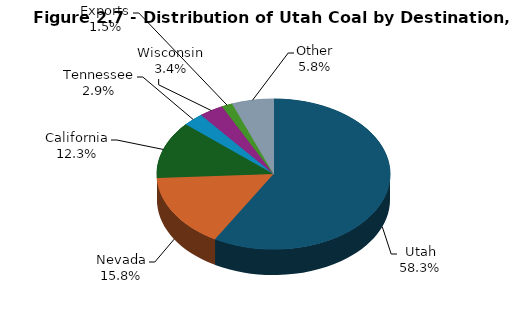
| Category | Series 0 |
|---|---|
| Utah | 13505 |
| Nevada | 3656 |
| California | 2854 |
| Tennessee | 667 |
| Wisconsin | 782 |
| Exports | 346 |
| Other | 1335 |